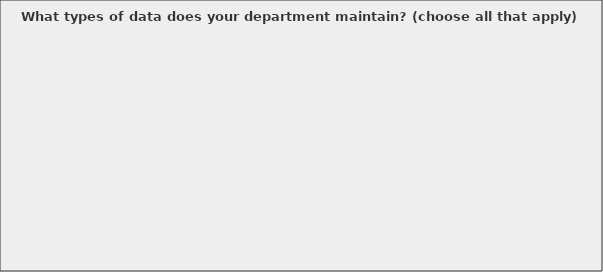
| Category | Series 0 |
|---|---|
| Parcel boundaries (i.e. subdivisions lots & blocks, tract land) | 0.438 |
| Land Ownership | 0.406 |
| GPS road data | 0.75 |
| Digitized road data | 0.625 |
| Address locations | 0.844 |
| Zoning boundaries | 0.594 |
| RSID/SID boundaries | 0.375 |
| Fire District boundaries | 0.531 |
| City Limit boundaries | 0.719 |
| Election boundaries | 0.438 |
| 911 data layers (such as emergency responders, ambulance response areas, etc.) | 0.594 |
| Utilities layers | 0.344 |